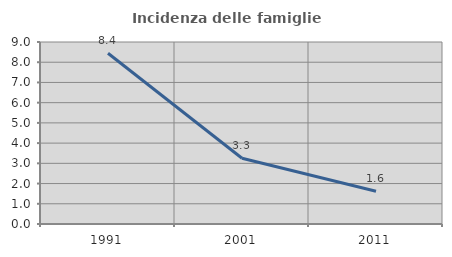
| Category | Incidenza delle famiglie numerose |
|---|---|
| 1991.0 | 8.445 |
| 2001.0 | 3.252 |
| 2011.0 | 1.622 |